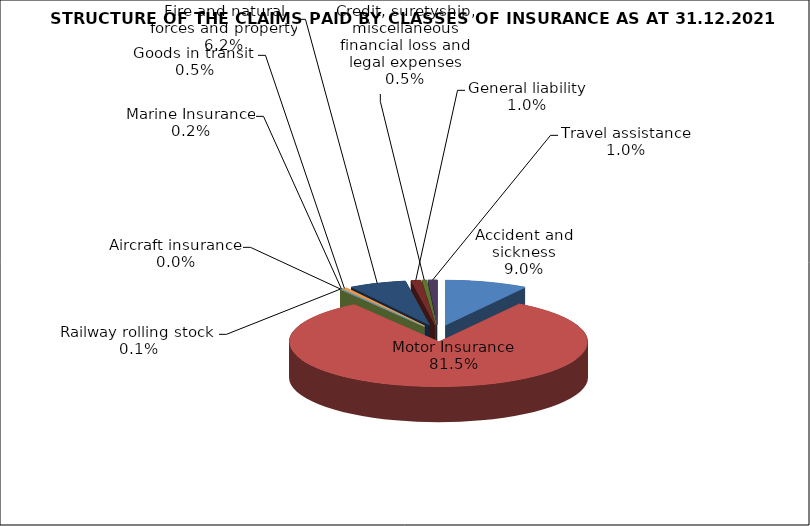
| Category | Accident and sickness |
|---|---|
| Accident and sickness | 0.09 |
| Motor Insurance | 0.815 |
| Railway rolling stock  | 0.001 |
| Aircraft insurance | 0 |
| Marine Insurance | 0.002 |
| Goods in transit  | 0.005 |
| Fire and natural forces and property | 0.062 |
| General liability | 0.01 |
| Credit, suretyship, miscellaneous financial loss and legal expenses | 0.005 |
| Travel assistance | 0.01 |